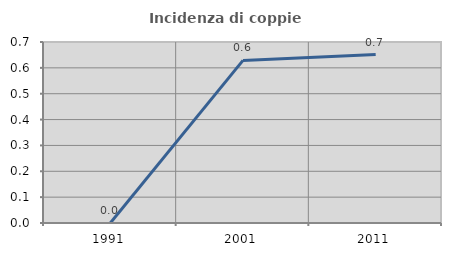
| Category | Incidenza di coppie miste |
|---|---|
| 1991.0 | 0 |
| 2001.0 | 0.629 |
| 2011.0 | 0.651 |